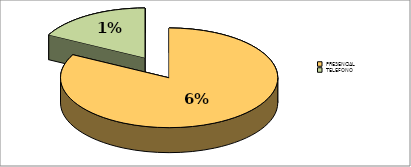
| Category | Series 0 |
|---|---|
| PRESENCIAL | 0.06 |
| TELEFONO | 0.013 |